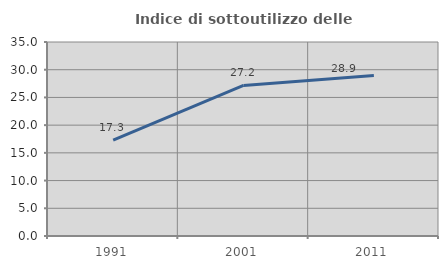
| Category | Indice di sottoutilizzo delle abitazioni  |
|---|---|
| 1991.0 | 17.284 |
| 2001.0 | 27.16 |
| 2011.0 | 28.947 |